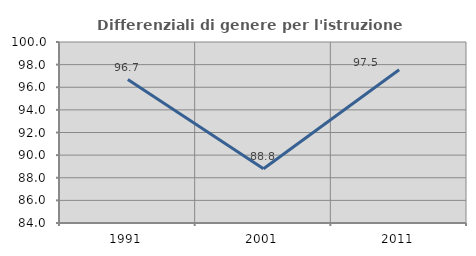
| Category | Differenziali di genere per l'istruzione superiore |
|---|---|
| 1991.0 | 96.68 |
| 2001.0 | 88.79 |
| 2011.0 | 97.55 |